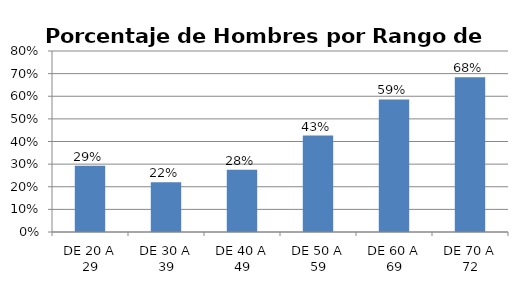
| Category | Porcentaje |
|---|---|
| DE 20 A 29 | 0.293 |
| DE 30 A 39 | 0.22 |
| DE 40 A 49 | 0.275 |
| DE 50 A 59 | 0.426 |
| DE 60 A 69 | 0.586 |
| DE 70 A 72 | 0.684 |